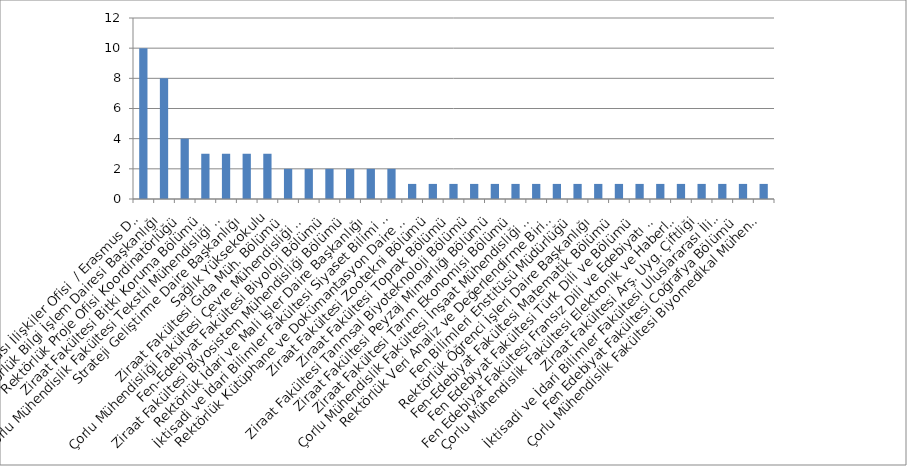
| Category | Series 0 |
|---|---|
| Rektörlük Uluslararası İlişkiler Ofisi  / Erasmus Değişim Programı Koord. | 10 |
| Rektörlük Bilgi İşlem Dairesi Başkanlığı | 8 |
| Rektörlük Proje Ofisi Koordinatörlüğü | 4 |
| Ziraat Fakültesi Bitki Koruma Bölümü | 3 |
| Çorlu Mühendislik Fakültesi Tekstil Mühendisliği Bölümü | 3 |
| Strateji Geliştirme Daire Başkanlığı | 3 |
| Sağlık Yüksekokulu | 3 |
| Ziraat Fakültesi Gıda Müh. Bölümü | 2 |
| Çorlu Mühendisliği Fakültesi Çevre Mühendisliği Bölümü | 2 |
| Fen-Edebiyat Fakültesi Biyoloji Bölümü | 2 |
| Ziraat Fakültesi Biyosistem Mühendisliği Bölümü | 2 |
| Rektörlük İdari ve Mali İşler Daire Başkanlığı | 2 |
| İktisadi ve İdari Bilimler Fakültesi Siyaset Bilimi ve Kamu Yönetimi Bölümü | 2 |
| Rektörlük Kütüphane ve Dokümantasyon Daire Başkanlığı | 1 |
| Ziraat Fakültesi Zootekni Bölümü | 1 |
| Ziraat Fakültesi Toprak Bölümü | 1 |
| Ziraat Fakültesi Tarımsal Biyoteknoloji Bölümü | 1 |
| Ziraat Fakültesi Peyzaj Mimarlığı Bölümü | 1 |
| Ziraat Fakültesi Tarım Ekonomisi Bölümü | 1 |
| Çorlu Mühendislik Fakültesi İnşaat Mühendisliği Bölümü | 1 |
| Rektörlük Veri Analiz ve Değerlendirme Birimi | 1 |
| Fen Bilimleri Enstitüsü Müdürlüğü | 1 |
| Rektörlük Öğrenci İşleri Daire Başkanlığı | 1 |
| Fen-Edebiyat Fakültesi Matematik Bölümü | 1 |
| Fen Edebiyat Fakültesi Türk Dili ve Bölümü | 1 |
| Fen Edebiyat Fakültesi Fransız Dili ve Edebiyatı Bölümü | 1 |
| Çorlu Mühendislik Fakültesi Elektronik ve Haberleşme Mühendisliği Bölümü | 1 |
| Ziraat Fakültesi Arş. Uyg. Çiftliği | 1 |
| İktisadi ve İdari Bilimler Fakültesi Uluslararası İlişkiler Bölümü | 1 |
| Fen Edebiyat Fakültesi Coğrafya Bölümü | 1 |
| Çorlu Mühendislik Fakültesi Biyomedikal Mühendisliği Bölümü | 1 |